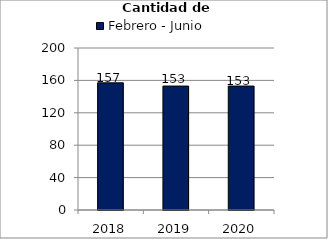
| Category | Febrero - Junio |
|---|---|
| 2018.0 | 157 |
| 2019.0 | 153 |
| 2020.0 | 153 |